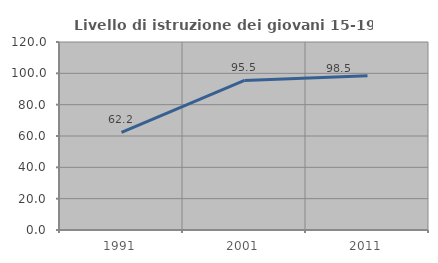
| Category | Livello di istruzione dei giovani 15-19 anni |
|---|---|
| 1991.0 | 62.241 |
| 2001.0 | 95.455 |
| 2011.0 | 98.485 |